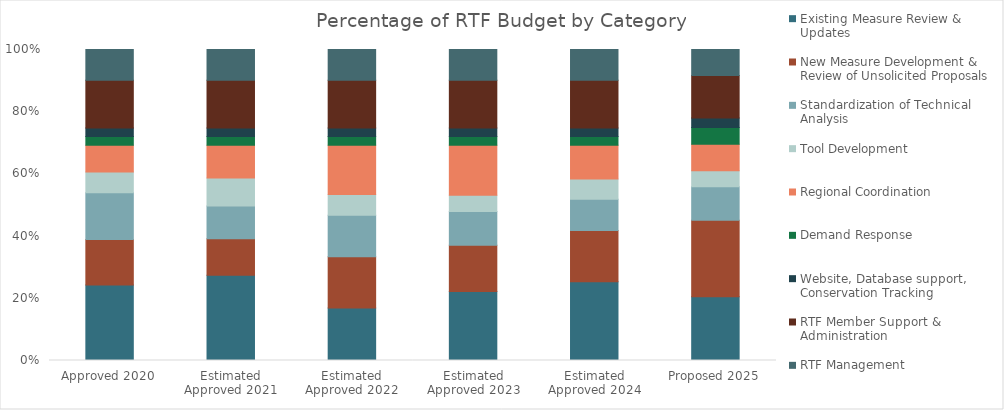
| Category | Existing Measure Review & Updates | New Measure Development & Review of Unsolicited Proposals | Standardization of Technical Analysis | Tool Development | Regional Coordination | Demand Response | Website, Database support, Conservation Tracking  | RTF Member Support & Administration | RTF Management |
|---|---|---|---|---|---|---|---|---|---|
| Approved 2020 | 0.243 | 0.147 | 0.15 | 0.067 | 0.086 | 0.028 | 0.028 | 0.153 | 0.099 |
| Estimated Approved 2021 | 0.274 | 0.117 | 0.106 | 0.09 | 0.106 | 0.028 | 0.028 | 0.153 | 0.099 |
| Estimated Approved 2022 | 0.169 | 0.165 | 0.133 | 0.067 | 0.158 | 0.028 | 0.028 | 0.153 | 0.099 |
| Estimated Approved 2023 | 0.222 | 0.149 | 0.108 | 0.052 | 0.161 | 0.028 | 0.028 | 0.153 | 0.099 |
| Estimated Approved 2024 | 0.253 | 0.165 | 0.1 | 0.066 | 0.108 | 0.028 | 0.028 | 0.153 | 0.099 |
| Proposed 2025 | 0.205 | 0.246 | 0.108 | 0.052 | 0.085 | 0.054 | 0.03 | 0.137 | 0.084 |